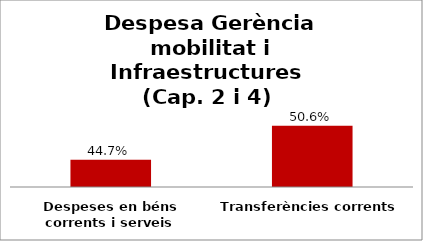
| Category | Series 0 |
|---|---|
| Despeses en béns corrents i serveis | 0.447 |
| Transferències corrents | 0.506 |